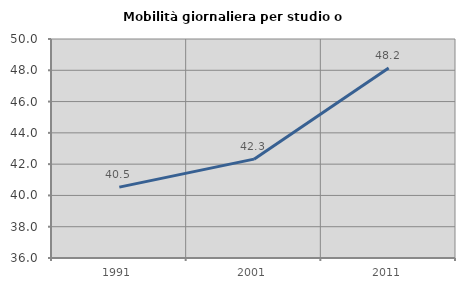
| Category | Mobilità giornaliera per studio o lavoro |
|---|---|
| 1991.0 | 40.53 |
| 2001.0 | 42.32 |
| 2011.0 | 48.152 |